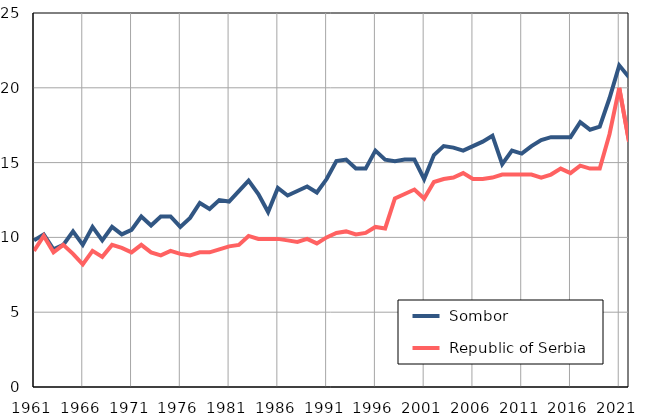
| Category |  Sombor |  Republic of Serbia |
|---|---|---|
| 1961.0 | 9.8 | 9.1 |
| 1962.0 | 10.2 | 10.1 |
| 1963.0 | 9.2 | 9 |
| 1964.0 | 9.5 | 9.5 |
| 1965.0 | 10.4 | 8.9 |
| 1966.0 | 9.5 | 8.2 |
| 1967.0 | 10.7 | 9.1 |
| 1968.0 | 9.8 | 8.7 |
| 1969.0 | 10.7 | 9.5 |
| 1970.0 | 10.2 | 9.3 |
| 1971.0 | 10.5 | 9 |
| 1972.0 | 11.4 | 9.5 |
| 1973.0 | 10.8 | 9 |
| 1974.0 | 11.4 | 8.8 |
| 1975.0 | 11.4 | 9.1 |
| 1976.0 | 10.7 | 8.9 |
| 1977.0 | 11.3 | 8.8 |
| 1978.0 | 12.3 | 9 |
| 1979.0 | 11.9 | 9 |
| 1980.0 | 12.5 | 9.2 |
| 1981.0 | 12.4 | 9.4 |
| 1982.0 | 13.1 | 9.5 |
| 1983.0 | 13.8 | 10.1 |
| 1984.0 | 12.9 | 9.9 |
| 1985.0 | 11.7 | 9.9 |
| 1986.0 | 13.3 | 9.9 |
| 1987.0 | 12.8 | 9.8 |
| 1988.0 | 13.1 | 9.7 |
| 1989.0 | 13.4 | 9.9 |
| 1990.0 | 13 | 9.6 |
| 1991.0 | 13.9 | 10 |
| 1992.0 | 15.1 | 10.3 |
| 1993.0 | 15.2 | 10.4 |
| 1994.0 | 14.6 | 10.2 |
| 1995.0 | 14.6 | 10.3 |
| 1996.0 | 15.8 | 10.7 |
| 1997.0 | 15.2 | 10.6 |
| 1998.0 | 15.1 | 12.6 |
| 1999.0 | 15.2 | 12.9 |
| 2000.0 | 15.2 | 13.2 |
| 2001.0 | 13.9 | 12.6 |
| 2002.0 | 15.5 | 13.7 |
| 2003.0 | 16.1 | 13.9 |
| 2004.0 | 16 | 14 |
| 2005.0 | 15.8 | 14.3 |
| 2006.0 | 16.1 | 13.9 |
| 2007.0 | 16.4 | 13.9 |
| 2008.0 | 16.8 | 14 |
| 2009.0 | 14.9 | 14.2 |
| 2010.0 | 15.8 | 14.2 |
| 2011.0 | 15.6 | 14.2 |
| 2012.0 | 16.1 | 14.2 |
| 2013.0 | 16.5 | 14 |
| 2014.0 | 16.7 | 14.2 |
| 2015.0 | 16.7 | 14.6 |
| 2016.0 | 16.7 | 14.3 |
| 2017.0 | 17.7 | 14.8 |
| 2018.0 | 17.2 | 14.6 |
| 2019.0 | 17.4 | 14.6 |
| 2020.0 | 19.3 | 16.9 |
| 2021.0 | 21.5 | 20 |
| 2022.0 | 20.7 | 16.4 |